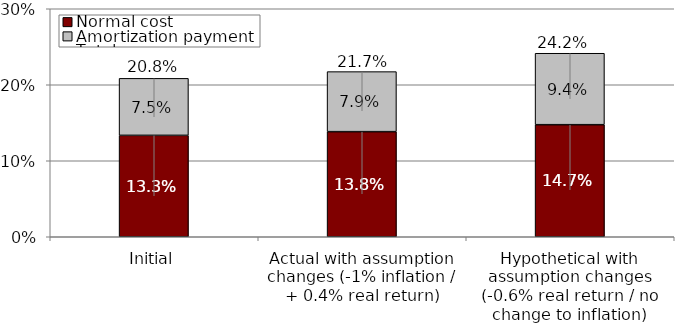
| Category | Normal cost | Amortization payment |
|---|---|---|
| Initial | 0.133 | 0.075 |
| Actual with assumption changes (-1% inflation / + 0.4% real return) | 0.138 | 0.079 |
| Hypothetical with assumption changes (-0.6% real return / no change to inflation) | 0.147 | 0.094 |